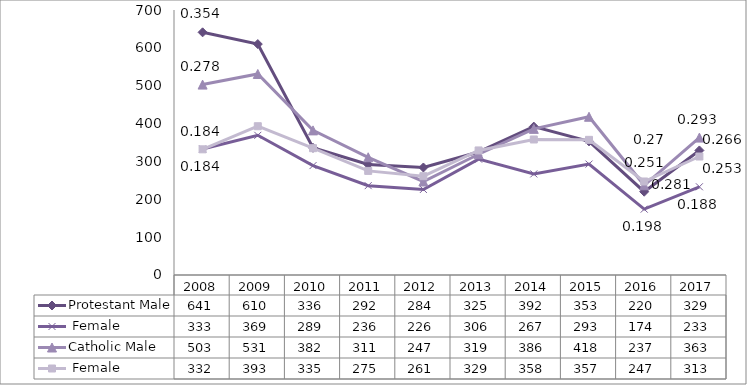
| Category | Protestant | Catholic |
|---|---|---|
| 2008.0 | 333 | 332 |
| 2009.0 | 369 | 393 |
| 2010.0 | 289 | 335 |
| 2011.0 | 236 | 275 |
| 2012.0 | 226 | 261 |
| 2013.0 | 306 | 329 |
| 2014.0 | 267 | 358 |
| 2015.0 | 293 | 357 |
| 2016.0 | 174 | 247 |
| 2017.0 | 233 | 313 |